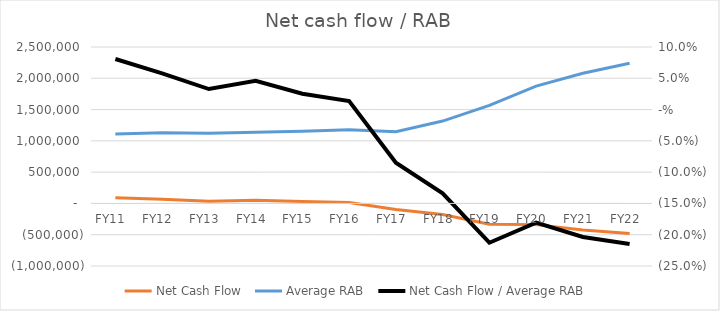
| Category | Net Cash Flow | Average RAB |
|---|---|---|
| FY11  | 89667.685 | 1109608.415 |
| FY12  | 65319.501 | 1128156.824 |
| FY13  | 36770.354 | 1121973.037 |
| FY14  | 52217.951 | 1135727.626 |
| FY15  | 29165.406 | 1155270.638 |
| FY16  | 15942.695 | 1178631.007 |
| FY17  | -97514.496 | 1147241.015 |
| FY18  | -176372.397 | 1316393.404 |
| FY19  | -333274.902 | 1566005.445 |
| FY20  | -338749.355 | 1874789.549 |
| FY21  | -423795.222 | 2080708.189 |
| FY22  | -481422.513 | 2239490.078 |